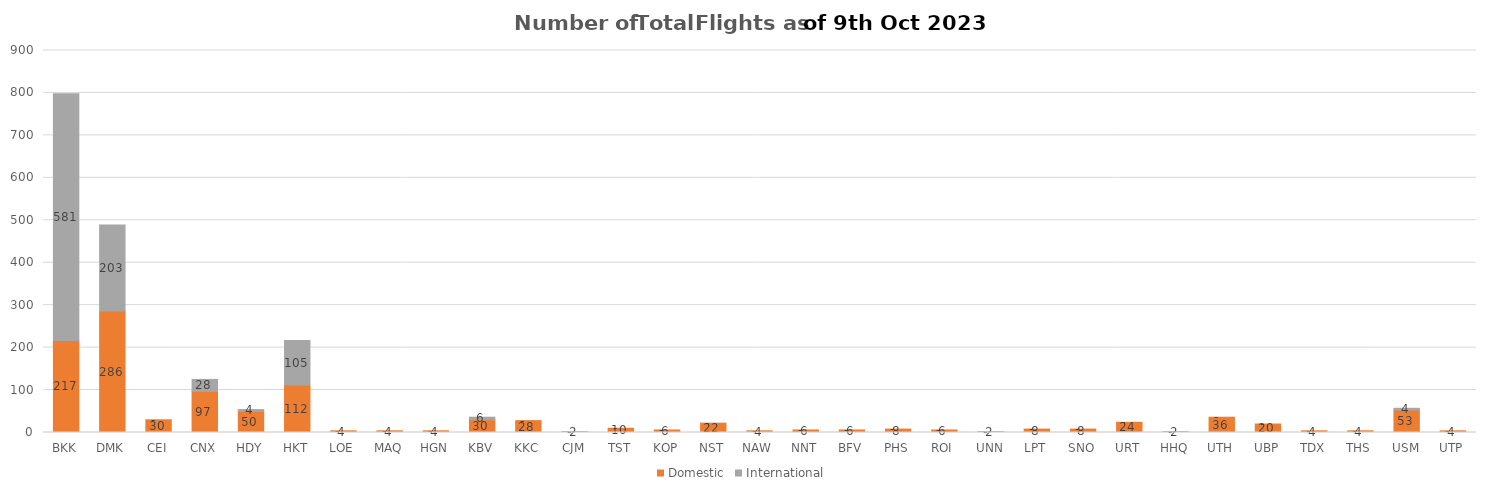
| Category | Domestic | International |
|---|---|---|
| BKK | 217 | 581 |
| DMK | 286 | 203 |
| CEI | 30 | 0 |
| CNX | 97 | 28 |
| HDY | 50 | 4 |
| HKT | 112 | 105 |
| LOE | 4 | 0 |
| MAQ | 4 | 0 |
| HGN | 4 | 0 |
| KBV | 30 | 6 |
| KKC | 28 | 0 |
| CJM | 2 | 0 |
| TST | 10 | 0 |
| KOP | 6 | 0 |
| NST | 22 | 0 |
| NAW | 4 | 0 |
| NNT | 6 | 0 |
| BFV | 6 | 0 |
| PHS | 8 | 0 |
| ROI | 6 | 0 |
| UNN | 2 | 0 |
| LPT | 8 | 0 |
| SNO | 8 | 0 |
| URT | 24 | 0 |
| HHQ | 2 | 0 |
| UTH | 36 | 0 |
| UBP | 20 | 0 |
| TDX | 4 | 0 |
| THS | 4 | 0 |
| USM | 53 | 4 |
| UTP | 4 | 0 |